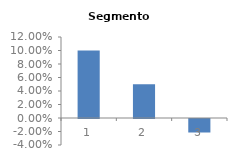
| Category | Segmento 1 |
|---|---|
| 0 | 0.1 |
| 1 | 0.05 |
| 2 | -0.02 |